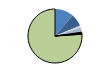
| Category | Series 0 |
|---|---|
| ARRASTRE | 93 |
| CERCO | 59 |
| ATUNEROS CAÑEROS | 3 |
| PALANGRE DE FONDO | 9 |
| PALANGRE DE SUPERFICIE | 23 |
| RASCO | 0 |
| VOLANTA | 5 |
| ARTES FIJAS | 5 |
| ARTES MENORES | 626 |